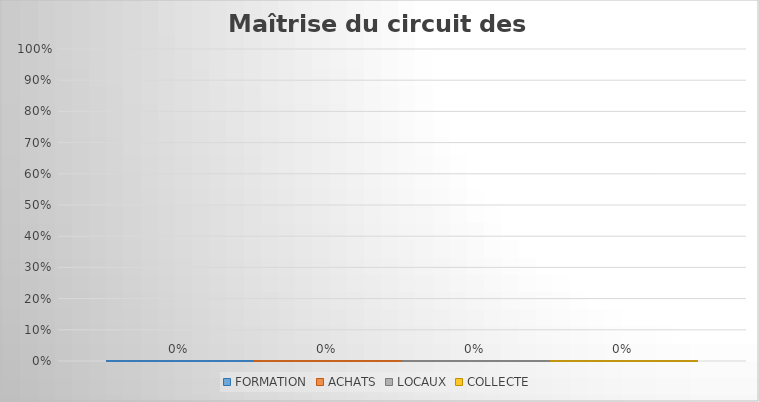
| Category | FORMATION | ACHATS | LOCAUX | COLLECTE |
|---|---|---|---|---|
| 0 | 0 | 0 | 0 | 0 |